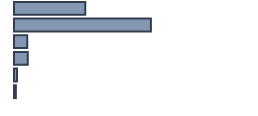
| Category | Percentatge |
|---|---|
| 0 | 29.696 |
| 1 | 57.043 |
| 2 | 5.522 |
| 3 | 5.739 |
| 4 | 1.217 |
| 5 | 0.783 |